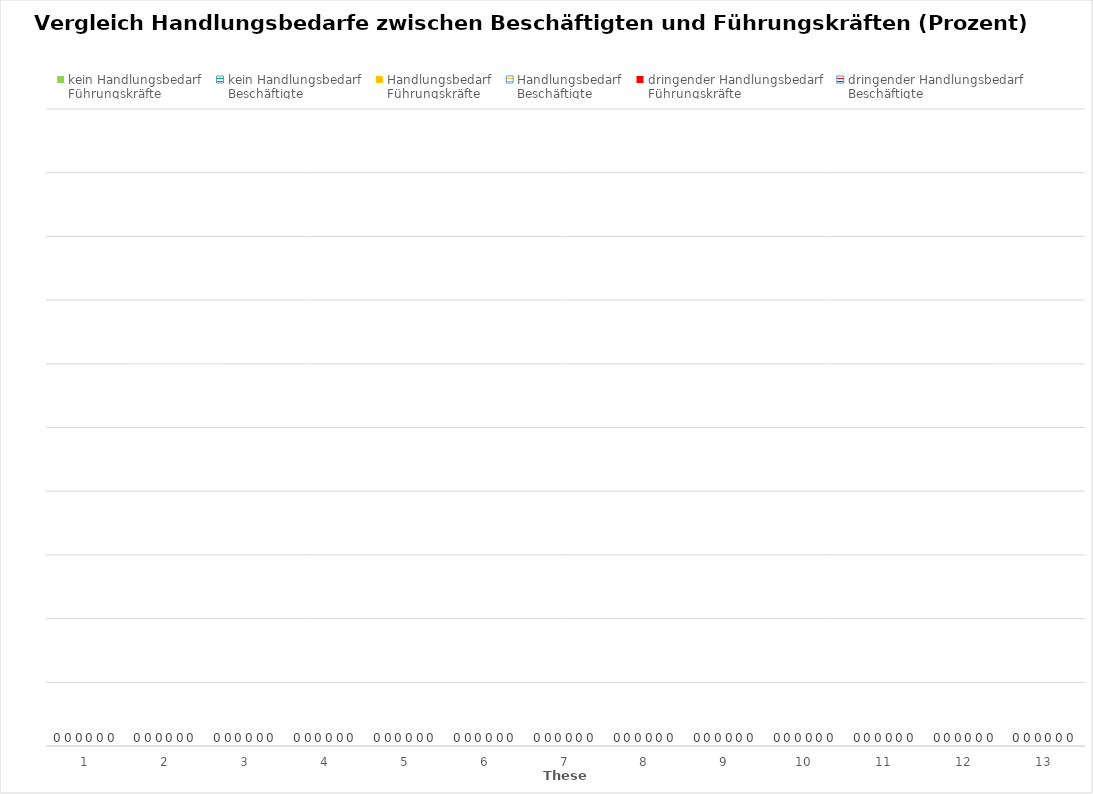
| Category | kein Handlungsbedarf
Führungskräfte | kein Handlungsbedarf
Beschäftigte | Handlungsbedarf
Führungskräfte | Handlungsbedarf
Beschäftigte | dringender Handlungsbedarf
Führungskräfte | dringender Handlungsbedarf
Beschäftigte |
|---|---|---|---|---|---|---|
| 1.0 | 0 | 0 | 0 | 0 | 0 | 0 |
| 2.0 | 0 | 0 | 0 | 0 | 0 | 0 |
| 3.0 | 0 | 0 | 0 | 0 | 0 | 0 |
| 4.0 | 0 | 0 | 0 | 0 | 0 | 0 |
| 5.0 | 0 | 0 | 0 | 0 | 0 | 0 |
| 6.0 | 0 | 0 | 0 | 0 | 0 | 0 |
| 7.0 | 0 | 0 | 0 | 0 | 0 | 0 |
| 8.0 | 0 | 0 | 0 | 0 | 0 | 0 |
| 9.0 | 0 | 0 | 0 | 0 | 0 | 0 |
| 10.0 | 0 | 0 | 0 | 0 | 0 | 0 |
| 11.0 | 0 | 0 | 0 | 0 | 0 | 0 |
| 12.0 | 0 | 0 | 0 | 0 | 0 | 0 |
| 13.0 | 0 | 0 | 0 | 0 | 0 | 0 |